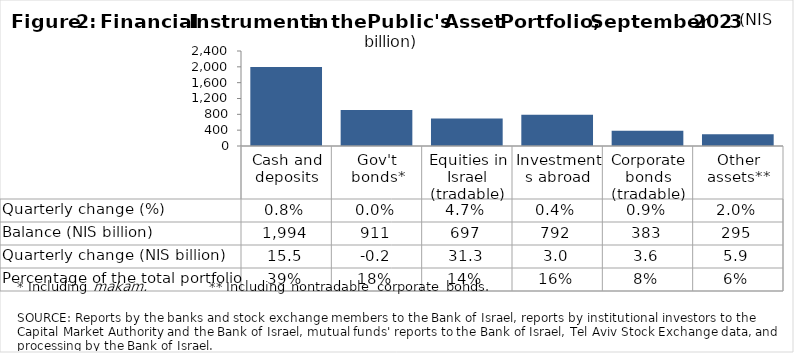
| Category | Balance (NIS billion) |
|---|---|
| Cash and deposits | 1994.15 |
| Gov't bonds* | 910.55 |
| Equities in Israel (tradable) | 696.84 |
| Investments abroad | 791.93 |
| Corporate bonds (tradable) | 383.11 |
| Other assets** | 295.12 |